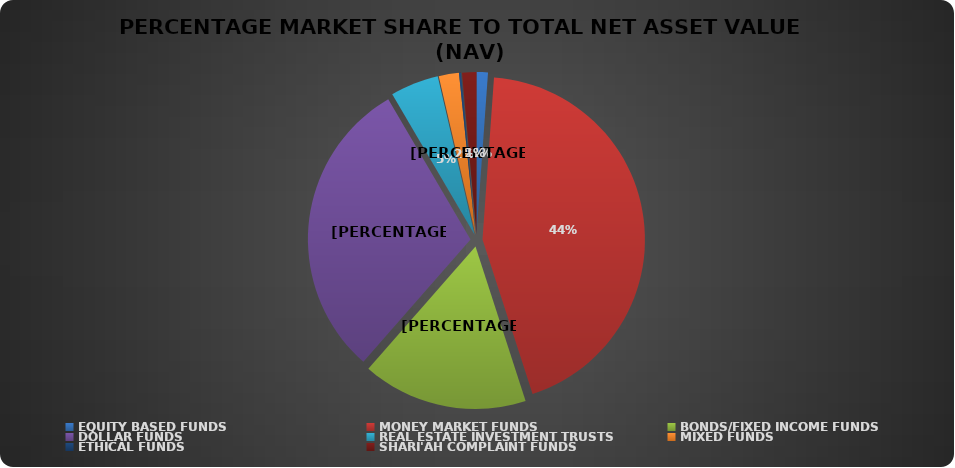
| Category | NET ASSET VALUE |
|---|---|
| EQUITY BASED FUNDS | 21948547893.36 |
| MONEY MARKET FUNDS | 852824801464.56 |
| BONDS/FIXED INCOME FUNDS | 319581951019.794 |
| DOLLAR FUNDS | 584920699343.905 |
| REAL ESTATE INVESTMENT TRUSTS | 93509583223.45 |
| MIXED FUNDS | 39079043179.51 |
| ETHICAL FUNDS | 3833193790.91 |
| SHARI'AH COMPLAINT FUNDS | 27709525793.34 |